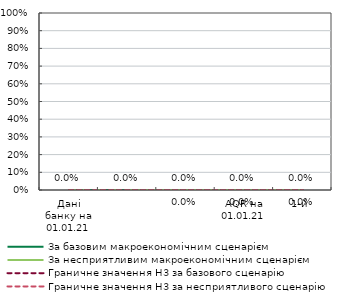
| Category | За базовим макроекономічним сценарієм | За несприятливим макроекономічним сценарієм | Граничне значення Н3 за базового сценарію | Граничне значення Н3 за несприятливого сценарію |
|---|---|---|---|---|
| Дані банку на 01.01.21 | 0 | 0 | 0 | 0 |
| AQR на 01.01.21 | 0 | 0 | 0 | 0 |
| 1-й | 0 | 0 | 0 | 0 |
| 2-й | 0 | 0 | 0 | 0 |
| 3-й | 0 | 0 | 0 | 0 |